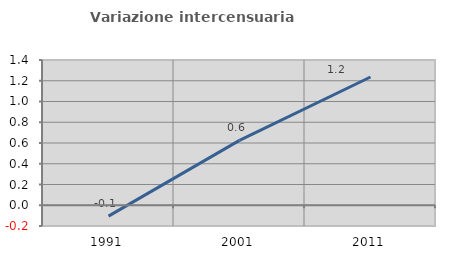
| Category | Variazione intercensuaria annua |
|---|---|
| 1991.0 | -0.105 |
| 2001.0 | 0.625 |
| 2011.0 | 1.236 |